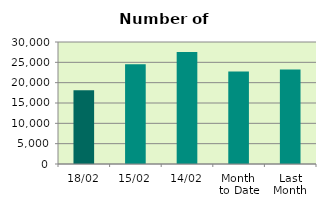
| Category | Series 0 |
|---|---|
| 18/02 | 18122 |
| 15/02 | 24520 |
| 14/02 | 27546 |
| Month 
to Date | 22727.833 |
| Last
Month | 23217.273 |